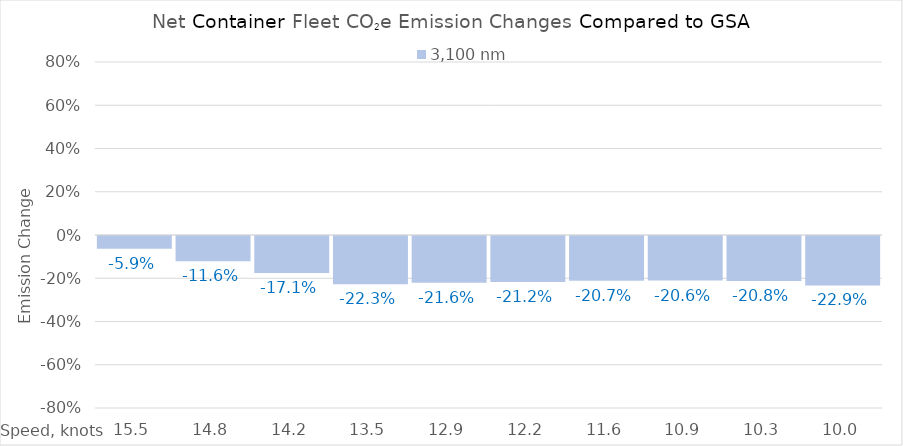
| Category | 3,100 |
|---|---|
| 15.450000000000001 | -0.059 |
| 14.8 | -0.116 |
| 14.15 | -0.171 |
| 13.5 | -0.223 |
| 12.85 | -0.216 |
| 12.2 | -0.212 |
| 11.549999999999999 | -0.207 |
| 10.899999999999999 | -0.206 |
| 10.249999999999998 | -0.208 |
| 10.0 | -0.229 |